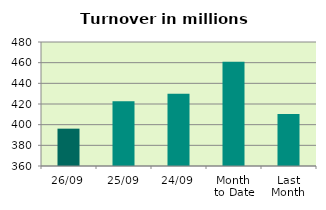
| Category | Series 0 |
|---|---|
| 26/09 | 396.133 |
| 25/09 | 422.587 |
| 24/09 | 429.807 |
| Month 
to Date | 460.803 |
| Last
Month | 410.207 |